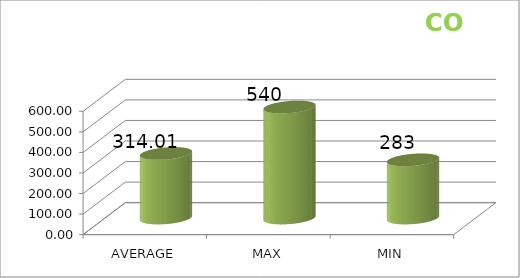
| Category | Series 0 |
|---|---|
| AVERAGE | 314.009 |
| MAX | 540 |
| MIN | 283 |